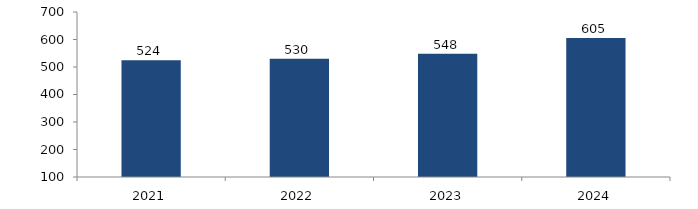
| Category | Bogotá |
|---|---|
| 2021.0 | 524.417 |
| 2022.0 | 530.446 |
| 2023.0 | 547.829 |
| 2024.0 | 605.436 |